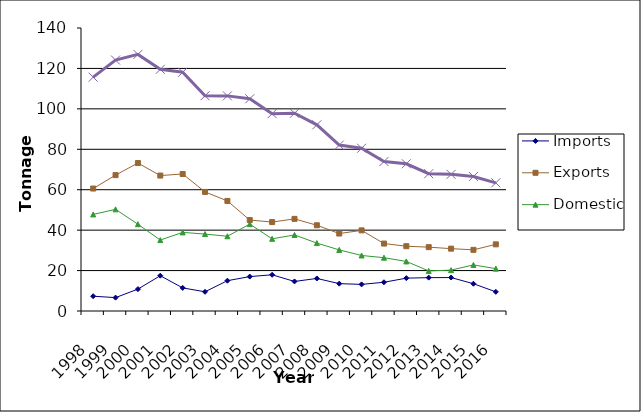
| Category | Imports | Exports | Domestic | TOTAL |
|---|---|---|---|---|
| 1998.0 | 7314 | 60584 | 47782 | 115680 |
| 1999.0 | 6623 | 67222 | 50293 | 124138 |
| 2000.0 | 10822 | 73194 | 42916 | 126932 |
| 2001.0 | 17467 | 67003 | 35098 | 119568 |
| 2002.0 | 11427 | 67783 | 38882 | 118090 |
| 2003.0 | 9501 | 58903 | 38068 | 106472 |
| 2004.0 | 14995 | 54454 | 36970 | 106417 |
| 2005.0 | 17024 | 45002 | 42967 | 104992 |
| 2006.0 | 17909 | 43994 | 35718 | 97621 |
| 2007.0 | 14612 | 45581 | 37619 | 97812 |
| 2008.0 | 16106 | 42416 | 33586 | 92108 |
| 2009.0 | 13532 | 38321 | 30228 | 82081 |
| 2010.0 | 13169 | 39891 | 27468 | 80525 |
| 2011.0 | 14216 | 33358 | 26379 | 73952 |
| 2012.0 | 16254 | 32060 | 24519 | 72832 |
| 2013.0 | 16501 | 31583 | 19833 | 67917 |
| 2014.0 | 16554 | 30842 | 20219 | 67615 |
| 2015.0 | 13481 | 30259 | 22813 | 66552 |
| 2016.0 | 9486 | 32974 | 20950 | 63409 |